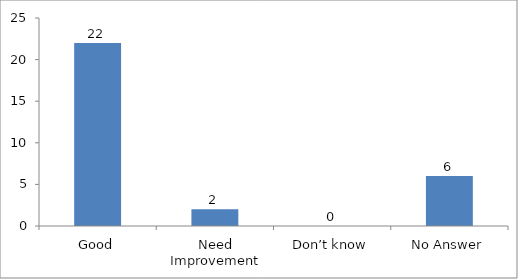
| Category | How would you rate the following aspects of the Changemaking Intelligence course?
The way the course is carried out. |
|---|---|
| Good | 22 |
| Need Improvement | 2 |
| Don’t know | 0 |
| No Answer | 6 |